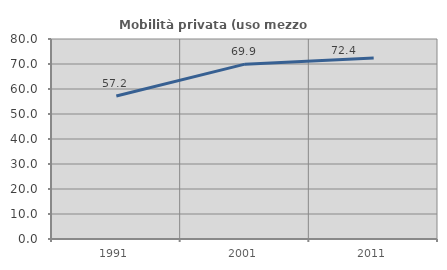
| Category | Mobilità privata (uso mezzo privato) |
|---|---|
| 1991.0 | 57.204 |
| 2001.0 | 69.935 |
| 2011.0 | 72.44 |